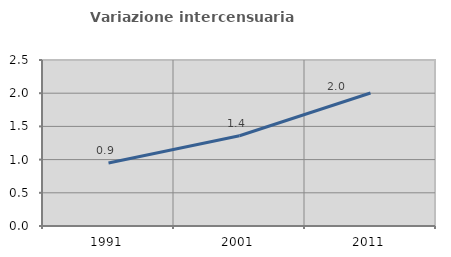
| Category | Variazione intercensuaria annua |
|---|---|
| 1991.0 | 0.948 |
| 2001.0 | 1.36 |
| 2011.0 | 2.003 |